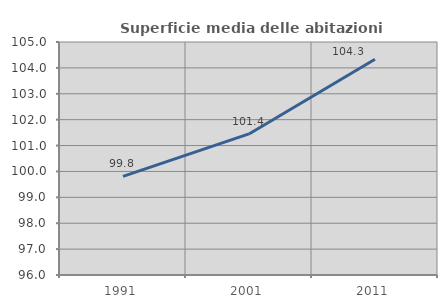
| Category | Superficie media delle abitazioni occupate |
|---|---|
| 1991.0 | 99.807 |
| 2001.0 | 101.449 |
| 2011.0 | 104.335 |